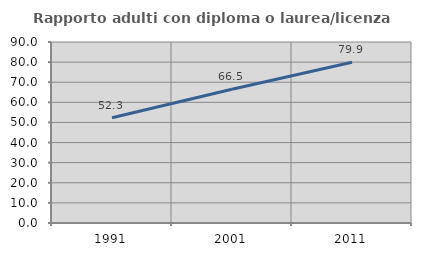
| Category | Rapporto adulti con diploma o laurea/licenza media  |
|---|---|
| 1991.0 | 52.316 |
| 2001.0 | 66.533 |
| 2011.0 | 79.938 |